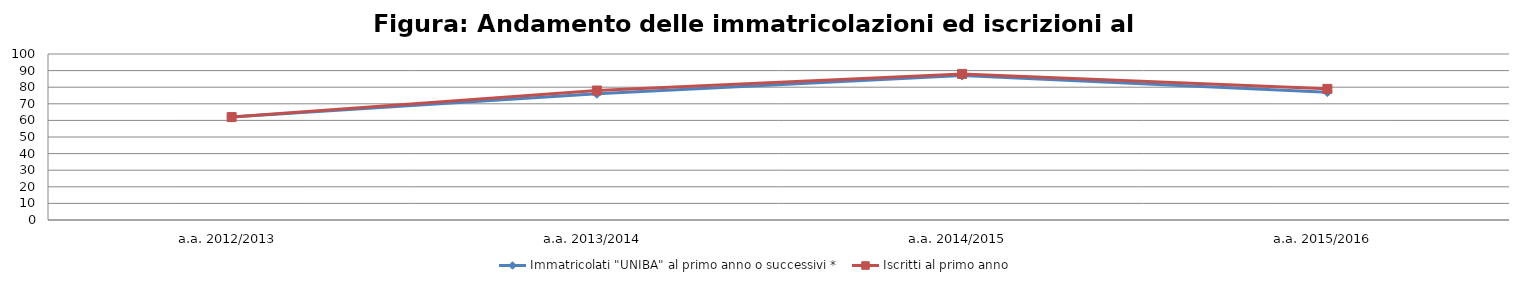
| Category | Immatricolati "UNIBA" al primo anno o successivi * | Iscritti al primo anno  |
|---|---|---|
| a.a. 2012/2013 | 62 | 62 |
| a.a. 2013/2014 | 76 | 78 |
| a.a. 2014/2015 | 87 | 88 |
| a.a. 2015/2016 | 77 | 79 |